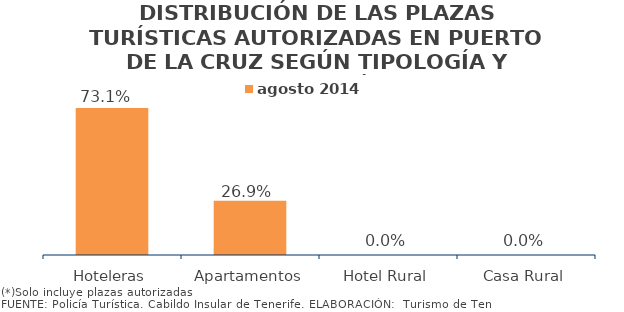
| Category | agosto 2014 |
|---|---|
| Hoteleras | 0.731 |
| Apartamentos | 0.269 |
| Hotel Rural | 0 |
| Casa Rural | 0 |